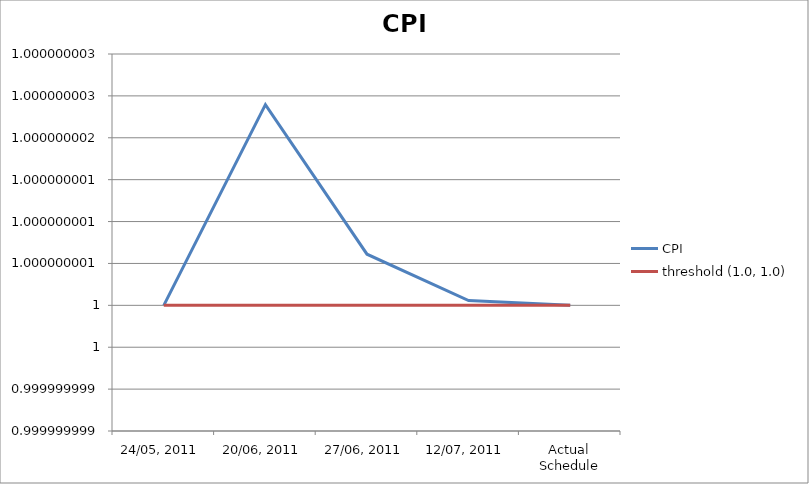
| Category | CPI | threshold (1.0, 1.0) |
|---|---|---|
| 24/05, 2011 | 1 | 1 |
| 20/06, 2011 | 1 | 1 |
| 27/06, 2011 | 1 | 1 |
| 12/07, 2011 | 1 | 1 |
| Actual Schedule | 1 | 1 |